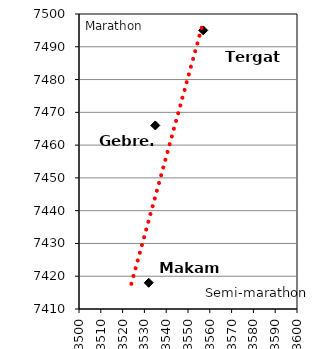
| Category | Series 0 |
|---|---|
| 3532.0 | 7418 |
| 3535.0 | 7466 |
| 3557.0 | 7495 |